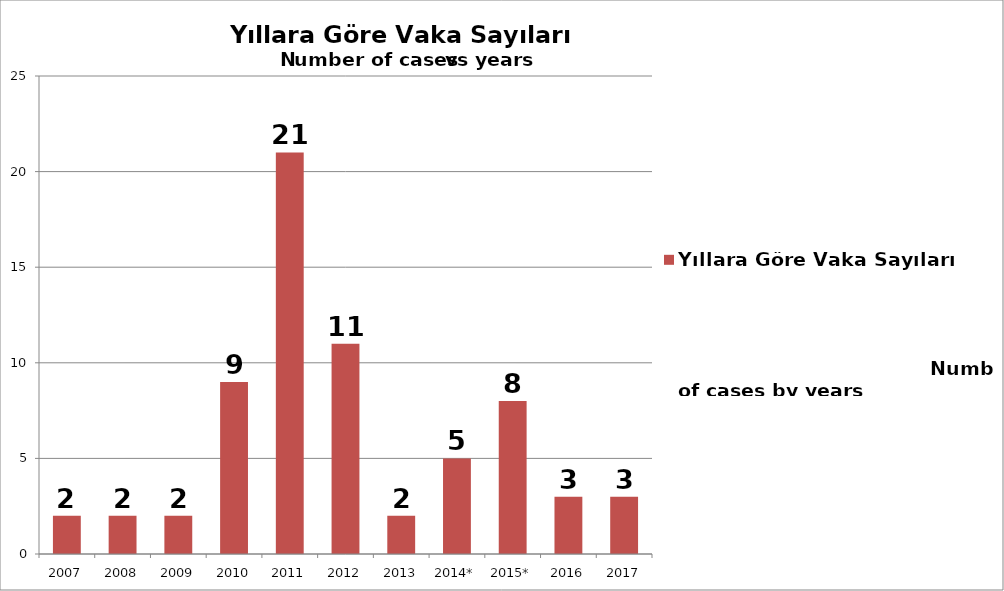
| Category | Yıllara Göre Vaka Sayıları                                                                                                                                                                                                                                      |
|---|---|
| 2007 | 2 |
| 2008 | 2 |
| 2009 | 2 |
| 2010 | 9 |
| 2011 | 21 |
| 2012 | 11 |
| 2013 | 2 |
| 2014* | 5 |
| 2015* | 8 |
| 2016 | 3 |
| 2017 | 3 |